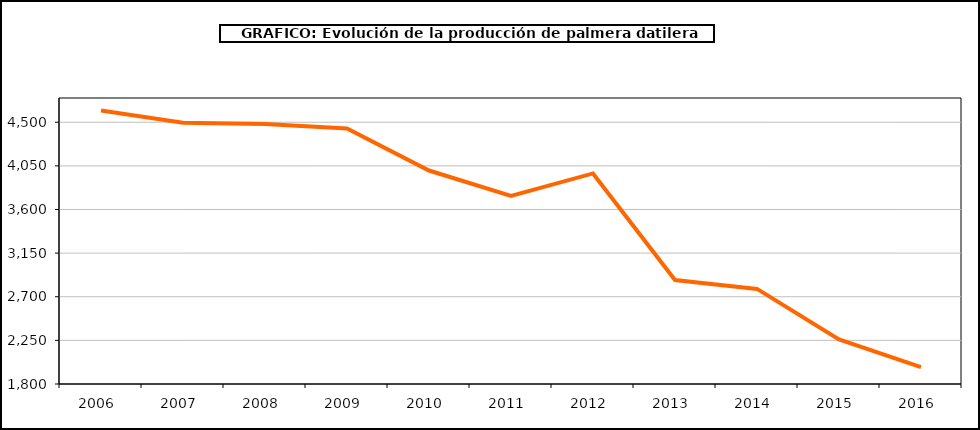
| Category | producción kiwi |
|---|---|
| 2006.0 | 4622 |
| 2007.0 | 4494 |
| 2008.0 | 4481 |
| 2009.0 | 4435 |
| 2010.0 | 4002 |
| 2011.0 | 3741 |
| 2012.0 | 3972 |
| 2013.0 | 2872 |
| 2014.0 | 2781 |
| 2015.0 | 2260 |
| 2016.0 | 1975 |